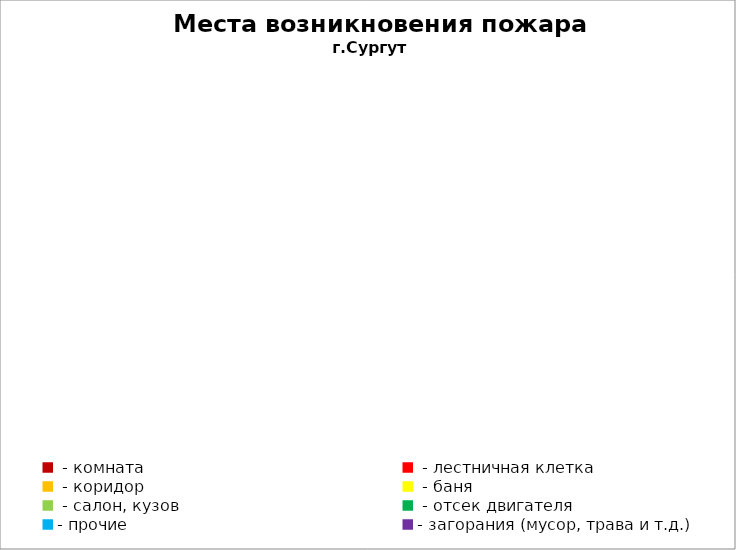
| Category | Места возникновения пожара |
|---|---|
|  - комната | 25 |
|  - лестничная клетка | 3 |
|  - коридор | 6 |
|  - баня | 6 |
|  - салон, кузов | 10 |
|  - отсек двигателя | 28 |
| - прочие | 70 |
| - загорания (мусор, трава и т.д.)  | 54 |